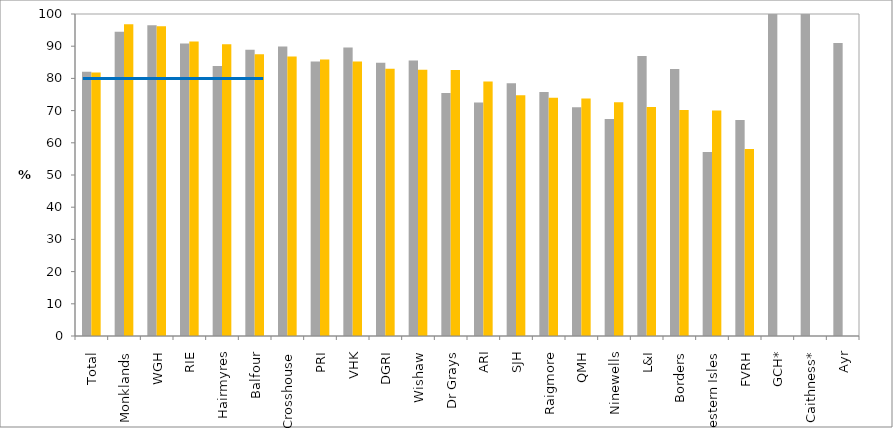
| Category | 2016 (%) | 2017 (%) |
|---|---|---|
| Total | 82.078 | 81.834 |
| Monklands | 94.521 | 96.855 |
| WGH | 96.491 | 96.205 |
| RIE | 90.833 | 91.469 |
| Hairmyres | 83.884 | 90.625 |
| Balfour | 88.889 | 87.5 |
| Crosshouse | 89.908 | 86.798 |
| PRI | 85.211 | 85.906 |
| VHK | 89.627 | 85.214 |
| DGRI | 84.884 | 82.979 |
| Wishaw | 85.556 | 82.677 |
| Dr Grays | 75.472 | 82.609 |
| ARI | 72.504 | 79.01 |
| SJH | 78.495 | 74.747 |
| Raigmore | 75.801 | 74.026 |
| QMH | 71.023 | 73.743 |
| Ninewells | 67.368 | 72.609 |
| L&I | 86.957 | 71.111 |
| Borders | 82.911 | 70.186 |
| Western Isles | 57.143 | 70 |
| FVRH | 67.073 | 58.039 |
| GCH* | 100 | 0 |
| Caithness* | 100 | 0 |
| Ayr | 90.991 | 0 |